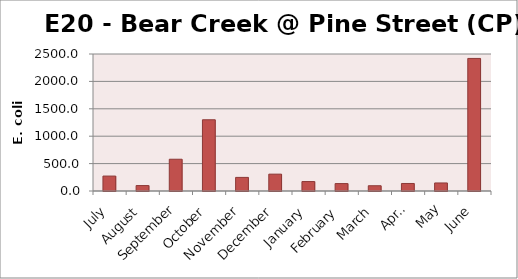
| Category | E. coli MPN |
|---|---|
| July | 272.3 |
| August | 99.1 |
| September | 579.4 |
| October | 1299.7 |
| November | 248.1 |
| December | 307.6 |
| January | 172.3 |
| February | 135.4 |
| March | 95.9 |
| April | 137.4 |
| May | 146.7 |
| June | 2419.2 |